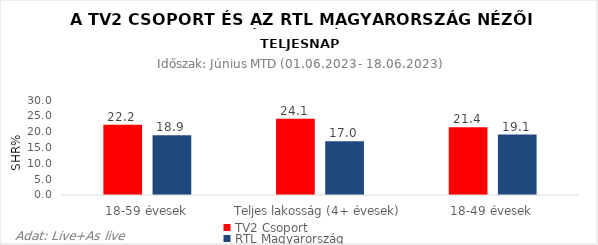
| Category | TV2 Csoport | RTL Magyarország |
|---|---|---|
| 18-59 évesek | 22.2 | 18.9 |
| Teljes lakosság (4+ évesek) | 24.1 | 17 |
| 18-49 évesek | 21.4 | 19.1 |